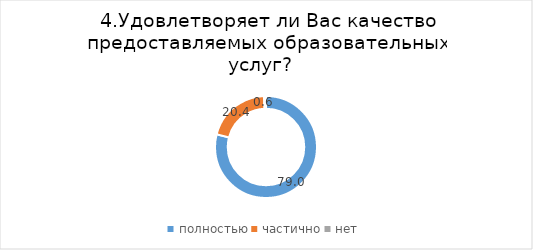
| Category | Series 0 |
|---|---|
| полностью | 79.017 |
| частично | 20.353 |
| нет | 0.63 |